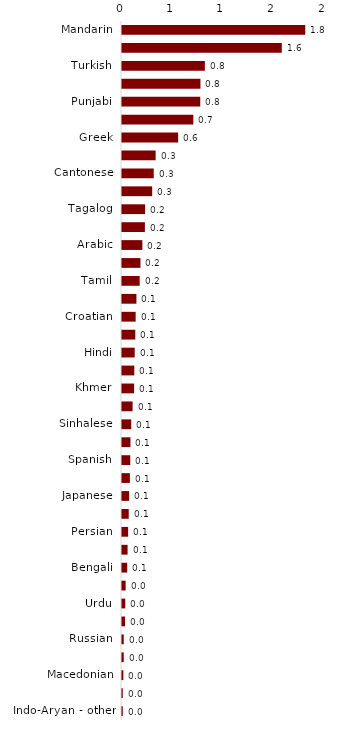
| Category | Series 0 |
|---|---|
| Mandarin | 1.814 |
| Italian | 1.582 |
| Turkish | 0.821 |
| Vietnamese | 0.777 |
| Punjabi | 0.775 |
| Austronesian - Other | 0.706 |
| Greek | 0.556 |
| Thai | 0.333 |
| Cantonese | 0.314 |
| Malayalam | 0.299 |
| Tagalog | 0.228 |
| Filipino | 0.227 |
| Arabic | 0.202 |
| Samoan | 0.183 |
| Tamil | 0.175 |
| Afrikaans | 0.143 |
| Croatian | 0.135 |
| Nepali | 0.131 |
| Hindi | 0.126 |
| German | 0.122 |
| Khmer | 0.12 |
| Korean | 0.105 |
| Sinhalese | 0.091 |
| Gujarati | 0.084 |
| Spanish | 0.082 |
| French | 0.078 |
| Japanese | 0.07 |
| Indonesian | 0.067 |
| Persian | 0.061 |
| Australian Indigenous Languages | 0.055 |
| Bengali | 0.051 |
| Serbian | 0.036 |
| Urdu | 0.032 |
| Chinese Ls other | 0.03 |
| Russian | 0.017 |
| Polish | 0.017 |
| Macedonian | 0.013 |
| Portuguese | 0.008 |
| Indo-Aryan - other | 0.008 |